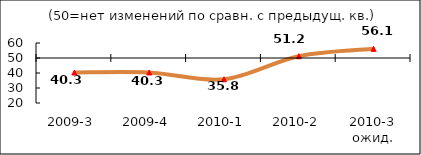
| Category | Диф.индекс ↓ |
|---|---|
| 2009-3 | 40.34 |
| 2009-4 | 40.345 |
| 2010-1 | 35.815 |
| 2010-2 | 51.195 |
| 2010-3 ожид. | 56.1 |